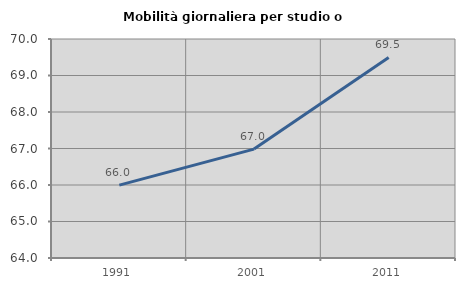
| Category | Mobilità giornaliera per studio o lavoro |
|---|---|
| 1991.0 | 65.997 |
| 2001.0 | 66.984 |
| 2011.0 | 69.494 |